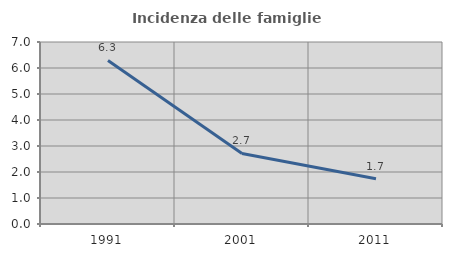
| Category | Incidenza delle famiglie numerose |
|---|---|
| 1991.0 | 6.292 |
| 2001.0 | 2.714 |
| 2011.0 | 1.739 |